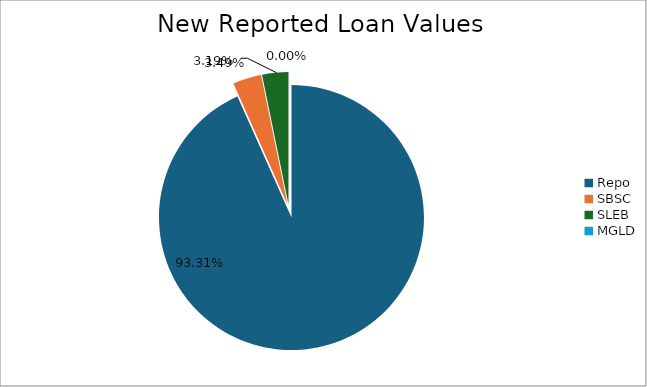
| Category | Series 0 |
|---|---|
| Repo | 13821245.789 |
| SBSC | 517223.675 |
| SLEB | 473221.957 |
| MGLD | 543.378 |